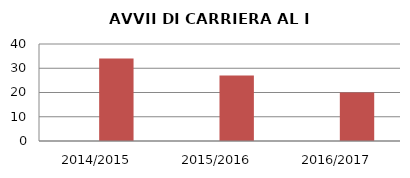
| Category | ANNO | NUMERO |
|---|---|---|
| 2014/2015 | 0 | 34 |
| 2015/2016 | 0 | 27 |
| 2016/2017 | 0 | 20 |